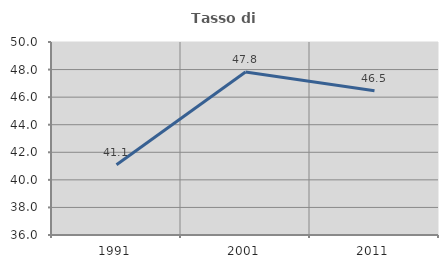
| Category | Tasso di occupazione   |
|---|---|
| 1991.0 | 41.093 |
| 2001.0 | 47.826 |
| 2011.0 | 46.465 |